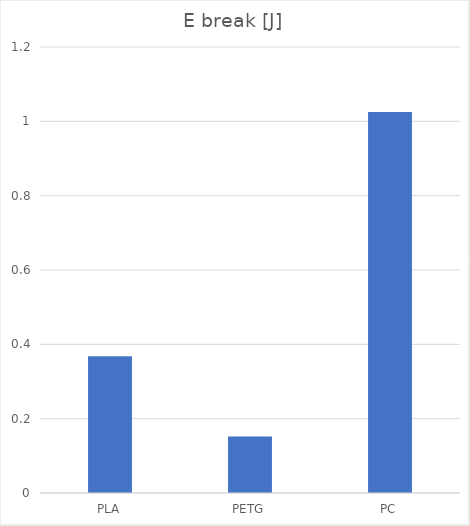
| Category | E br [J] |
|---|---|
| PLA | 0.368 |
| PETG | 0.152 |
| PC | 1.025 |